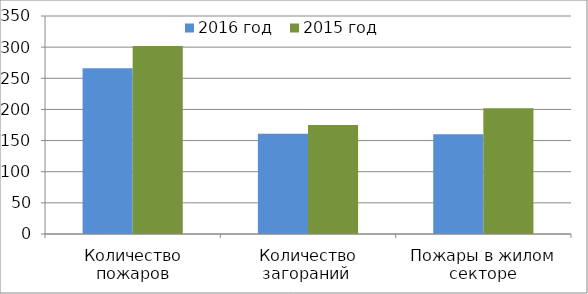
| Category | 2016 год | 2015 год |
|---|---|---|
| Количество пожаров | 266 | 302 |
| Количество загораний  | 161 | 175 |
| Пожары в жилом секторе | 160 | 202 |